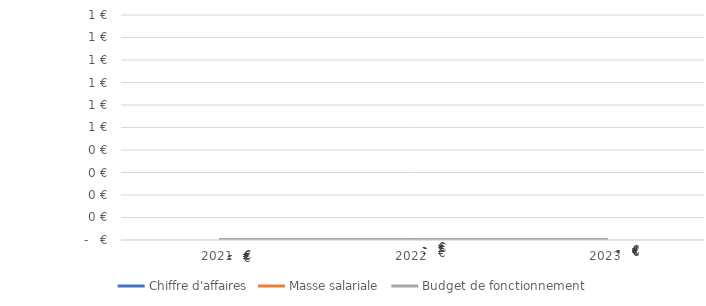
| Category | Chiffre d'affaires | Masse salariale | Budget de fonctionnement |
|---|---|---|---|
| 2021.0 | 0 | 0 | 0 |
| 2022.0 | 0 | 0 | 0 |
| 2023.0 | 0 | 0 | 0 |